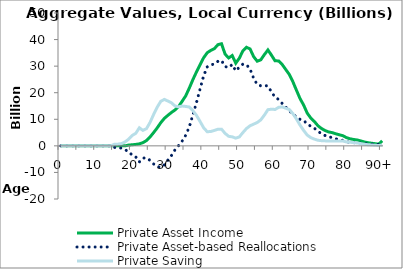
| Category | Private Asset Income | Private Asset-based Reallocations | Private Saving |
|---|---|---|---|
| 0 | 0 | 0 | 0 |
|  | 0 | 0 | 0 |
| 2 | 0 | 0 | 0 |
| 3 | 0 | 0 | 0 |
| 4 | 0 | 0 | 0 |
| 5 | 0 | 0 | 0 |
| 6 | 0 | 0 | 0 |
| 7 | 0 | 0 | 0 |
| 8 | 0 | 0 | 0 |
| 9 | 0 | 0 | 0 |
| 10 | 0 | 0 | 0 |
| 11 | 0 | 0 | 0 |
| 12 | 0 | 0 | 0 |
| 13 | 0 | 0 | 0 |
| 14 | 0 | 0 | 0 |
| 15 | 0 | -605.24 | 605.24 |
| 16 | 0 | -646.75 | 646.75 |
| 17 | 0.484 | -850.497 | 850.98 |
| 18 | 12.333 | -1468.702 | 1481.035 |
| 19 | 287.816 | -2214.057 | 2501.872 |
| 20 | 415.323 | -3494.491 | 3909.814 |
| 21 | 545.18 | -4169.673 | 4714.853 |
| 22 | 750.449 | -6047.105 | 6797.554 |
| 23 | 1191.693 | -4629.216 | 5820.909 |
| 24 | 2003.38 | -4480.535 | 6483.915 |
| 25 | 3358.422 | -5477.887 | 8836.308 |
| 26 | 5002.127 | -6826.049 | 11828.177 |
| 27 | 6762.819 | -7800.237 | 14563.056 |
| 28 | 8729.724 | -8028.837 | 16758.561 |
| 29 | 10343.549 | -7137.902 | 17481.451 |
| 30 | 11505.244 | -5353.142 | 16858.386 |
| 31 | 12575.115 | -3605.736 | 16180.85 |
| 32 | 13530.204 | -1454.301 | 14984.504 |
| 33 | 14818.188 | 123.936 | 14694.252 |
| 34 | 16811.352 | 1835.25 | 14976.102 |
| 35 | 18865.706 | 4038.088 | 14827.618 |
| 36 | 21805.634 | 7190.202 | 14615.432 |
| 37 | 24952.948 | 11729.307 | 13223.641 |
| 38 | 27839.655 | 16371.594 | 11468.061 |
| 39 | 30546.421 | 21375.439 | 9170.982 |
| 40 | 33165.662 | 26368.856 | 6796.806 |
| 41 | 35042.451 | 29718.032 | 5324.419 |
| 42 | 35922.983 | 30529.554 | 5393.429 |
| 43 | 36578.192 | 30773.723 | 5804.469 |
| 44 | 38081.667 | 31829.262 | 6252.405 |
| 45 | 38436.995 | 32150.131 | 6286.864 |
| 46 | 34536.361 | 29834.94 | 4701.421 |
| 47 | 33079.452 | 29479.667 | 3599.785 |
| 48 | 33992.391 | 30609.361 | 3383.03 |
| 49 | 31115.508 | 28210.912 | 2904.596 |
| 50 | 33013.631 | 29636.291 | 3377.34 |
| 51 | 35787.92 | 30773.276 | 5014.644 |
| 52 | 37082.681 | 30547.479 | 6535.202 |
| 53 | 36478.519 | 28921.502 | 7557.017 |
| 54 | 33575.321 | 25404.298 | 8171.022 |
| 55 | 31857.851 | 23074.094 | 8783.757 |
| 56 | 32379.06 | 22607.628 | 9771.432 |
| 57 | 34328.87 | 22773.422 | 11555.448 |
| 58 | 36097.422 | 22488.356 | 13609.066 |
| 59 | 34103.675 | 20291.794 | 13811.88 |
| 60 | 31991.552 | 18306.727 | 13684.826 |
| 61 | 31976.362 | 17476.025 | 14500.337 |
| 62 | 30608.419 | 15943.53 | 14664.889 |
| 63 | 28725.252 | 14567.726 | 14157.526 |
| 64 | 26838.628 | 13165.412 | 13673.216 |
| 65 | 24093.296 | 12011.765 | 12081.53 |
| 66 | 20887.796 | 10810.887 | 10076.909 |
| 67 | 17765.39 | 9981.602 | 7783.788 |
| 68 | 15358.871 | 9554.767 | 5804.104 |
| 69 | 12320.97 | 8253.552 | 4067.418 |
| 70 | 10470.893 | 7378.003 | 3092.89 |
| 71 | 9177.627 | 6644.571 | 2533.056 |
| 72 | 7572.56 | 5473.515 | 2099.045 |
| 73 | 6520.993 | 4572.72 | 1948.274 |
| 74 | 5765.458 | 3889.532 | 1875.926 |
| 75 | 5233.154 | 3400.627 | 1832.527 |
| 76 | 4974.651 | 3117.317 | 1857.335 |
| 77 | 4539.99 | 2678.611 | 1861.379 |
| 78 | 4164.826 | 2335.637 | 1829.189 |
| 79 | 3818.994 | 2021.724 | 1797.27 |
| 80 | 3084.604 | 1600.648 | 1483.955 |
| 81 | 2646.462 | 1299.435 | 1347.027 |
| 82 | 2405.478 | 1176.488 | 1228.991 |
| 83 | 2208.076 | 1122.498 | 1085.578 |
| 84 | 1855.651 | 1011.293 | 844.357 |
| 85 | 1466.769 | 859.355 | 607.415 |
| 86 | 1183.361 | 746.571 | 436.79 |
| 87 | 998.023 | 667.291 | 330.732 |
| 88 | 813.581 | 597.023 | 216.557 |
| 89 | 646.651 | 514.759 | 131.892 |
| 90+ | 1871.953 | 1598.348 | 273.605 |